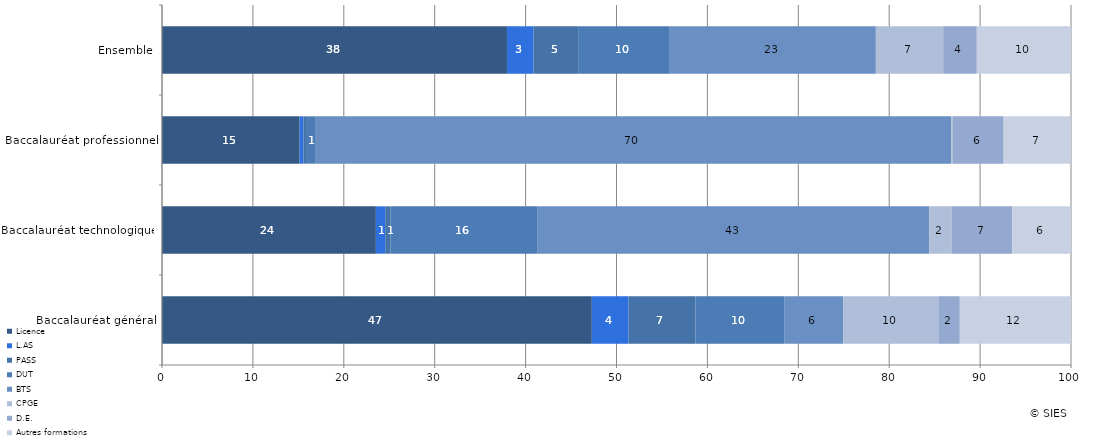
| Category | Licence | L.AS | PASS | DUT | BTS | CPGE | D.E. | Autres formations |
|---|---|---|---|---|---|---|---|---|
| Baccalauréat général | 47.287 | 4.041 | 7.353 | 9.82 | 6.434 | 10.474 | 2.357 | 12.233 |
| Baccalauréat technologique | 23.53 | 1.022 | 0.599 | 16.185 | 43.073 | 2.482 | 6.651 | 6.458 |
| Baccalauréat professionnel | 15.133 | 0.433 | 0.272 | 0.998 | 69.989 | 0.186 | 5.582 | 7.407 |
| Ensemble | 37.96 | 2.919 | 4.974 | 10.009 | 22.67 | 7.406 | 3.7 | 10.362 |